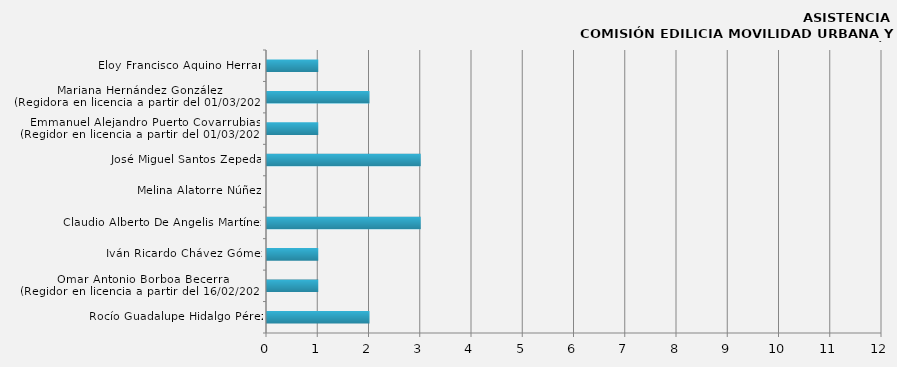
| Category | Series 0 |
|---|---|
| Rocío Guadalupe Hidalgo Pérez | 2 |
| Omar Antonio Borboa Becerra 
(Regidor en licencia a partir del 16/02/2024) | 1 |
| Iván Ricardo Chávez Gómez | 1 |
| Claudio Alberto De Angelis Martínez | 3 |
| Melina Alatorre Núñez | 0 |
| José Miguel Santos Zepeda | 3 |
| Emmanuel Alejandro Puerto Covarrubias
(Regidor en licencia a partir del 01/03/2024) | 1 |
| Mariana Hernández González
(Regidora en licencia a partir del 01/03/2024) | 2 |
| Eloy Francisco Aquino Herran | 1 |